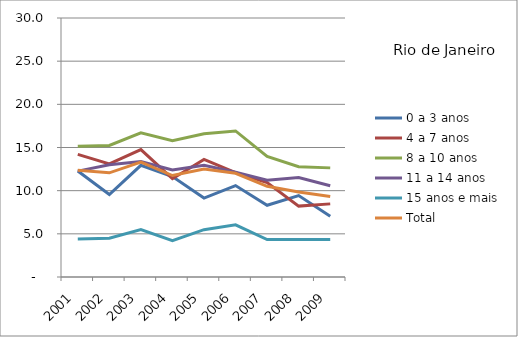
| Category | 0 a 3 anos | 4 a 7 anos | 8 a 10 anos | 11 a 14 anos | 15 anos e mais | Total |
|---|---|---|---|---|---|---|
| 2001.0 | 12.27 | 14.2 | 15.14 | 12.26 | 4.4 | 12.37 |
| 2002.0 | 9.55 | 13.11 | 15.23 | 13.01 | 4.49 | 12.07 |
| 2003.0 | 12.94 | 14.76 | 16.71 | 13.38 | 5.49 | 13.32 |
| 2004.0 | 11.63 | 11.39 | 15.8 | 12.4 | 4.2 | 11.75 |
| 2005.0 | 9.14 | 13.62 | 16.6 | 12.94 | 5.48 | 12.52 |
| 2006.0 | 10.59 | 12.08 | 16.92 | 12.13 | 6.04 | 12.01 |
| 2007.0 | 8.31 | 10.94 | 13.97 | 11.2 | 4.33 | 10.51 |
| 2008.0 | 9.43 | 8.21 | 12.78 | 11.51 | 4.33 | 9.85 |
| 2009.0 | 7.05 | 8.47 | 12.64 | 10.57 | 4.33 | 9.32 |